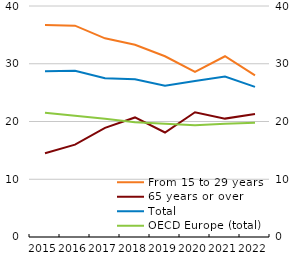
| Category | From 15 to 29 years | 65 years or over |
|---|---|---|
| 2015.0 | 36.7 | 14.5 |
| 2016.0 | 36.6 | 16 |
| 2017.0 | 34.4 | 18.9 |
| 2018.0 | 33.3 | 20.7 |
| 2019.0 | 31.3 | 18.1 |
| 2020.0 | 28.6 | 21.6 |
| 2021.0 | 31.3 | 20.5 |
| 2022.0 | 28 | 21.3 |